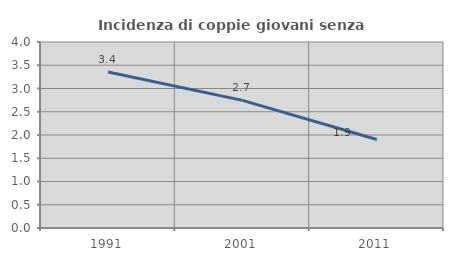
| Category | Incidenza di coppie giovani senza figli |
|---|---|
| 1991.0 | 3.353 |
| 2001.0 | 2.745 |
| 2011.0 | 1.902 |